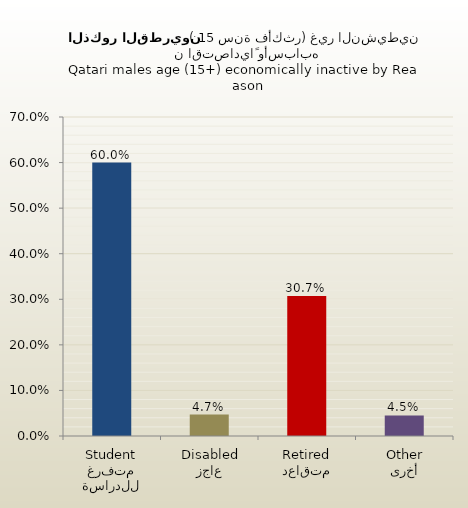
| Category | الذكور القطريين |
|---|---|
| متفرغ للدراسة
Student | 0.6 |
| عاجز
Disabled | 0.047 |
| متقاعد
Retired | 0.307 |
| أخرى
Other | 0.045 |